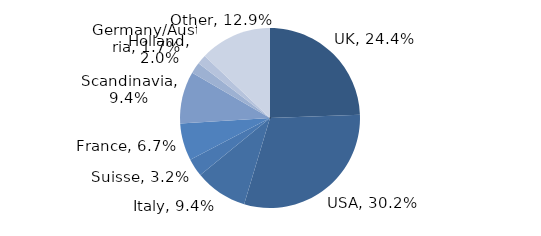
| Category | Investment Style |
|---|---|
| UK | 0.244 |
| USA | 0.302 |
| Italy | 0.094 |
| Suisse | 0.032 |
| France | 0.067 |
| Scandinavia | 0.094 |
| Holland | 0.02 |
| Germany/Austria | 0.017 |
| Other | 0.129 |